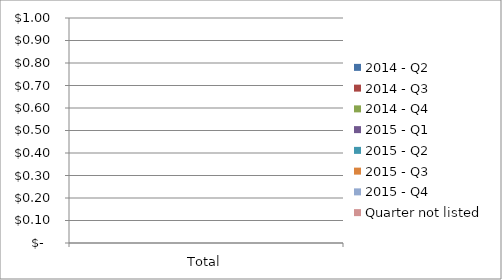
| Category | 2014 - Q2 | 2014 - Q3 | 2014 - Q4 | 2015 - Q1 | 2015 - Q2 | 2015 - Q3 | 2015 - Q4 | Quarter not listed |
|---|---|---|---|---|---|---|---|---|
| Total | 0 | 0 | 0 | 0 | 0 | 0 | 0 | 0 |